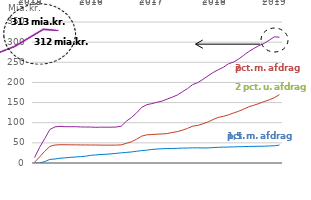
| Category | 1,5 pct. m. afdrag | 2 pct. m. afdrag | 2 pct. u. afdrag |
|---|---|---|---|
| 2015-01-01 | 0 | 13.407 | 2.018 |
| 2015-02-01 | 0.113 | 39.078 | 15.193 |
| 2015-03-01 | 3.54 | 60.597 | 29.176 |
| 2015-04-01 | 8.888 | 83.141 | 41.227 |
| 2015-05-01 | 9.917 | 89.684 | 44.673 |
| 2015-06-01 | 11.87 | 90.843 | 45.331 |
| 2015-07-01 | 12.825 | 90.124 | 45.31 |
| 2015-08-01 | 13.932 | 90.026 | 45.153 |
| 2015-09-01 | 14.958 | 90.141 | 45.004 |
| 2015-10-01 | 15.775 | 89.478 | 44.883 |
| 2015-11-01 | 16.851 | 89.314 | 44.769 |
| 2015-12-01 | 19.108 | 89.27 | 44.692 |
| 2016-01-01 | 20.006 | 88.56 | 44.616 |
| 2016-02-01 | 21.112 | 89.039 | 44.415 |
| 2016-03-01 | 21.734 | 88.892 | 44.306 |
| 2016-04-01 | 22.715 | 88.964 | 44.406 |
| 2016-05-01 | 23.997 | 89.23 | 44.439 |
| 2016-06-01 | 25.194 | 91.452 | 45.105 |
| 2016-07-01 | 26.326 | 103.925 | 48.869 |
| 2016-08-01 | 27.444 | 112.929 | 52.75 |
| 2016-09-01 | 29.16 | 124.6 | 59.181 |
| 2016-10-01 | 30.73 | 137.924 | 66.625 |
| 2016-11-01 | 31.847 | 144.75 | 69.868 |
| 2016-12-01 | 33.646 | 147.421 | 70.672 |
| 2017-01-01 | 34.613 | 150.732 | 71.566 |
| 2017-02-01 | 35.392 | 153.655 | 72.007 |
| 2017-03-01 | 35.916 | 158.696 | 73.162 |
| 2017-04-01 | 36.131 | 163.49 | 75.597 |
| 2017-05-01 | 36.332 | 168.894 | 77.975 |
| 2017-06-01 | 37.059 | 177.101 | 81.446 |
| 2017-07-01 | 37.18 | 184.809 | 86.072 |
| 2017-08-01 | 37.662 | 194.68 | 91.403 |
| 2017-09-01 | 37.691 | 199.494 | 93.364 |
| 2017-10-01 | 37.413 | 207.566 | 97.312 |
| 2017-11-01 | 37.386 | 216.046 | 101.91 |
| 2017-12-01 | 38.271 | 224.615 | 107.907 |
| 2018-01-01 | 38.952 | 231.408 | 113.091 |
| 2018-02-01 | 39.332 | 237.506 | 115.832 |
| 2018-03-01 | 39.681 | 246.213 | 119.402 |
| 2018-04-01 | 39.967 | 250.611 | 124.105 |
| 2018-05-01 | 40.361 | 258.015 | 128.419 |
| 2018-06-01 | 40.727 | 267.449 | 133.887 |
| 2018-07-01 | 41.093 | 276.732 | 139.567 |
| 2018-08-01 | 41.345 | 284.358 | 143.445 |
| 2018-09-01 | 41.506 | 291.498 | 147.635 |
| 2018-10-01 | 41.727 | 296.847 | 152.574 |
| 2018-11-01 | 42.43 | 304.872 | 156.755 |
| 2018-12-01 | 42.693 | 313.241 | 162.18 |
| 2019-01-01 | 44.529 | 312.142 | 169.705 |